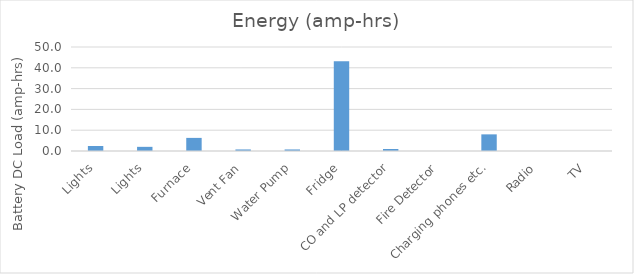
| Category | Energy (amp-hrs) |
|---|---|
| Lights | 2.4 |
| Lights | 2 |
| Furnace | 6.3 |
| Vent Fan | 0.75 |
| Water Pump | 0.75 |
| Fridge | 43.2 |
| CO and LP detector | 0.96 |
| Fire Detector | 0 |
| Charging phones etc. | 8 |
| Radio | 0 |
| TV | 0 |